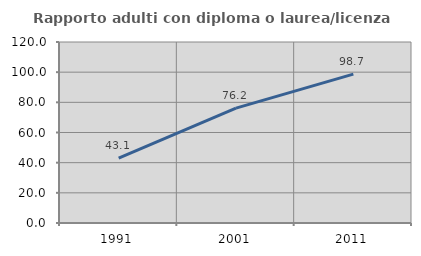
| Category | Rapporto adulti con diploma o laurea/licenza media  |
|---|---|
| 1991.0 | 43.067 |
| 2001.0 | 76.152 |
| 2011.0 | 98.677 |